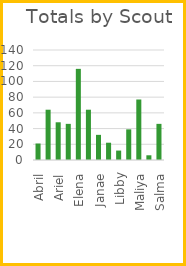
| Category | Total |
|---|---|
| Abril | 21 |
| Aliza | 64 |
| Ariel | 48 |
| Dixie | 46 |
| Elena | 116 |
| Ivy | 64 |
| Janae | 32 |
| Krista | 22 |
| Libby | 12 |
| Lillie | 39 |
| Maliya | 77 |
| Mary | 6 |
| Salma | 46 |